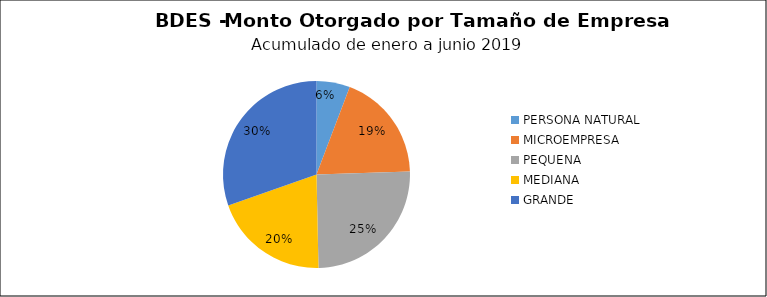
| Category | Monto | Créditos |
|---|---|---|
| PERSONA NATURAL | 6.102 | 529 |
| MICROEMPRESA | 19.744 | 1667 |
| PEQUENA | 26.526 | 662 |
| MEDIANA | 21.064 | 208 |
| GRANDE | 32.024 | 87 |